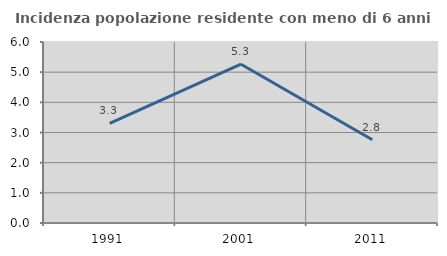
| Category | Incidenza popolazione residente con meno di 6 anni |
|---|---|
| 1991.0 | 3.299 |
| 2001.0 | 5.263 |
| 2011.0 | 2.761 |